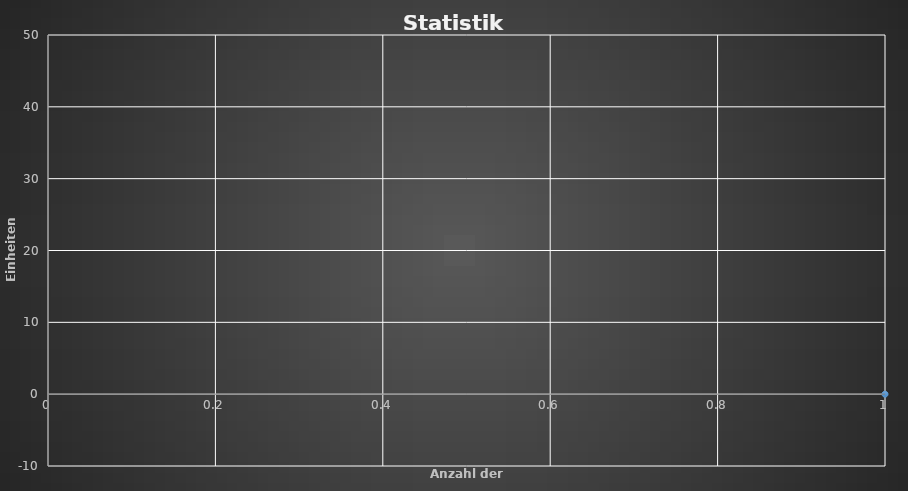
| Category | Series 0 |
|---|---|
| 0 | 0 |
| 1 | 0.985 |
| 2 | -0.515 |
| 3 | -2.014 |
| 4 | 1.736 |
| 5 | 0.236 |
| 6 | 2.896 |
| 7 | 0.896 |
| 8 | 2.746 |
| 9 | 1.746 |
| 10 | 3.126 |
| 11 | 1.126 |
| 12 | 1.908 |
| 13 | 0.408 |
| 14 | -1.092 |
| 15 | 0.329 |
| 16 | -0.671 |
| 17 | -2.171 |
| 18 | -0.416 |
| 19 | 3.934 |
| 20 | 8.434 |
| 21 | 9.784 |
| 22 | 14.329 |
| 23 | 16.737 |
| 24 | 15.237 |
| 25 | 12.737 |
| 26 | 12.237 |
| 27 | 10.737 |
| 28 | 12.612 |
| 29 | 10.612 |
| 30 | 9.612 |
| 31 | 6.612 |
| 32 | 5.612 |
| 33 | 6.312 |
| 34 | 7.961 |
| 35 | 9.611 |
| 36 | 8.111 |
| 37 | 9.176 |
| 38 | 10.976 |
| 39 | 9.476 |
| 40 | 10.281 |
| 41 | 11.941 |
| 42 | 10.441 |
| 43 | 11.36 |
| 44 | 13.775 |
| 45 | 15.475 |
| 46 | 16.175 |
| 47 | 15.175 |
| 48 | 16.203 |
| 49 | 15.703 |
| 50 | 14.703 |
| 51 | 17.958 |
| 52 | 21.827 |
| 53 | 20.827 |
| 54 | 23.032 |
| 55 | 23.77 |
| 56 | 22.77 |
| 57 | 20.77 |
| 58 | 24.37 |
| 59 | 22.37 |
| 60 | 20.37 |
| 61 | 21.705 |
| 62 | 20.705 |
| 63 | 22.354 |
| 64 | 20.854 |
| 65 | 19.854 |
| 66 | 21.174 |
| 67 | 23.074 |
| 68 | 24.124 |
| 69 | 22.124 |
| 70 | 20.124 |
| 71 | 18.624 |
| 72 | 20.139 |
| 73 | 22.554 |
| 74 | 20.554 |
| 75 | 19.554 |
| 76 | 20.846 |
| 77 | 23.486 |
| 78 | 24.889 |
| 79 | 24.389 |
| 80 | 23.389 |
| 81 | 21.389 |
| 82 | 22.673 |
| 83 | 24.313 |
| 84 | 22.313 |
| 85 | 21.313 |
| 86 | 24.463 |
| 87 | 27.783 |
| 88 | 26.783 |
| 89 | 25.783 |
| 90 | 24.783 |
| 91 | 26.883 |
| 92 | 29.083 |
| 93 | 28.083 |
| 94 | 27.083 |
| 95 | 24.083 |
| 96 | 22.083 |
| 97 | 21.583 |
| 98 | 23.843 |
| 99 | 24.799 |
| 100 | 26.599 |
| 101 | 28.118 |
| 102 | 27.118 |
| 103 | 26.118 |
| 104 | 26.684 |
| 105 | 25.184 |
| 106 | 23.684 |
| 107 | 25.297 |
| 108 | 26.406 |
| 109 | 25.406 |
| 110 | 27.656 |
| 111 | 28.881 |
| 112 | 27.881 |
| 113 | 29.16 |
| 114 | 31.41 |
| 115 | 29.91 |
| 116 | 31.01 |
| 117 | 32.25 |
| 118 | 33.675 |
| 119 | 36.795 |
| 120 | 37.895 |
| 121 | 37.395 |
| 122 | 36.895 |
| 123 | 40.095 |
| 124 | 39.595 |
| 125 | 43.165 |
| 126 | 40.165 |
| 127 | 39.165 |
| 128 | 41.165 |
| 129 | 42.147 |
| 130 | 40.647 |
| 131 | 39.647 |
| 132 | 36.647 |
| 133 | 38.097 |
| 134 | 39.747 |
| 135 | 38.747 |
| 136 | 40.523 |
| 137 | 42.61 |
| 138 | 41.61 |
| 139 | 41.11 |
| 140 | 45.726 |